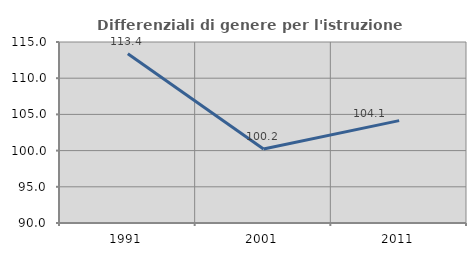
| Category | Differenziali di genere per l'istruzione superiore |
|---|---|
| 1991.0 | 113.383 |
| 2001.0 | 100.224 |
| 2011.0 | 104.143 |